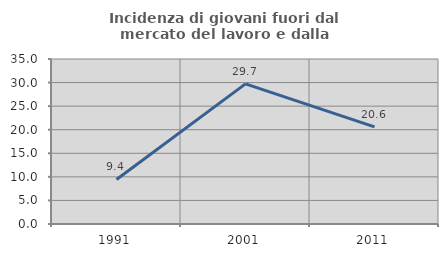
| Category | Incidenza di giovani fuori dal mercato del lavoro e dalla formazione  |
|---|---|
| 1991.0 | 9.447 |
| 2001.0 | 29.73 |
| 2011.0 | 20.613 |